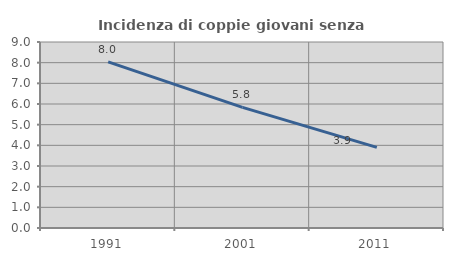
| Category | Incidenza di coppie giovani senza figli |
|---|---|
| 1991.0 | 8.041 |
| 2001.0 | 5.836 |
| 2011.0 | 3.904 |